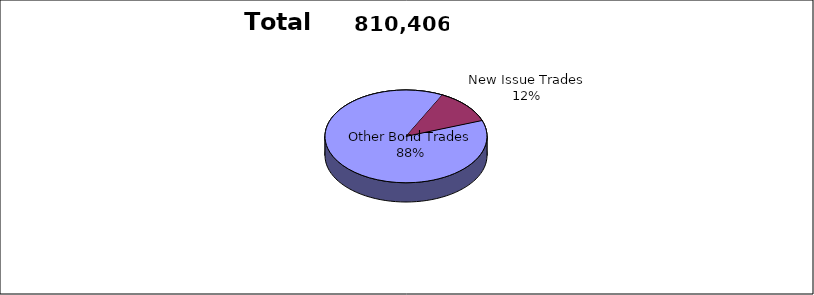
| Category | Series 0 |
|---|---|
| Other Bond Trades | 712739 |
| New Issue Trades | 97667 |